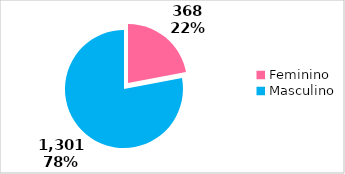
| Category | Qtde |
|---|---|
| Feminino | 368 |
| Masculino | 1301 |